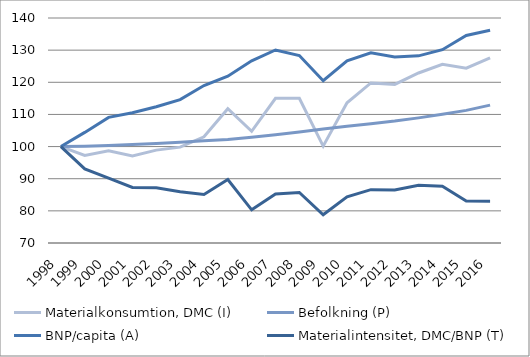
| Category | Materialkonsumtion, DMC (I) | Befolkning (P) | BNP/capita (A) | Materialintensitet, DMC/BNP (T) |
|---|---|---|---|---|
| 1998.0 | 100 | 100 | 100 | 100 |
| 1999.0 | 97.24 | 100.08 | 104.407 | 93.06 |
| 2000.0 | 98.687 | 100.322 | 109.08 | 90.182 |
| 2001.0 | 97.091 | 100.619 | 110.543 | 87.291 |
| 2002.0 | 98.893 | 100.977 | 112.376 | 87.151 |
| 2003.0 | 99.827 | 101.37 | 114.597 | 85.933 |
| 2004.0 | 103.031 | 101.774 | 118.997 | 85.073 |
| 2005.0 | 111.775 | 102.185 | 121.888 | 89.742 |
| 2006.0 | 104.739 | 102.924 | 126.684 | 80.328 |
| 2007.0 | 115.004 | 103.711 | 130.054 | 85.264 |
| 2008.0 | 114.997 | 104.54 | 128.306 | 85.735 |
| 2009.0 | 100.141 | 105.493 | 120.478 | 78.792 |
| 2010.0 | 113.635 | 106.339 | 126.699 | 84.343 |
| 2011.0 | 119.79 | 107.099 | 129.155 | 86.601 |
| 2012.0 | 119.353 | 107.923 | 127.891 | 86.473 |
| 2013.0 | 122.892 | 108.928 | 128.223 | 87.987 |
| 2014.0 | 125.62 | 110.086 | 130.138 | 87.685 |
| 2015.0 | 124.39 | 111.257 | 134.554 | 83.093 |
| 2016.0 | 127.621 | 112.884 | 136.195 | 83.01 |